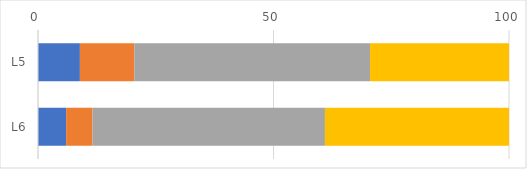
| Category | Series 0 | Series 1 | Series 2 | Series 3 |
|---|---|---|---|---|
| L5 | 8.897 | 11.546 | 50.052 | 29.505 |
| L6 | 5.972 | 5.603 | 49.347 | 39.077 |